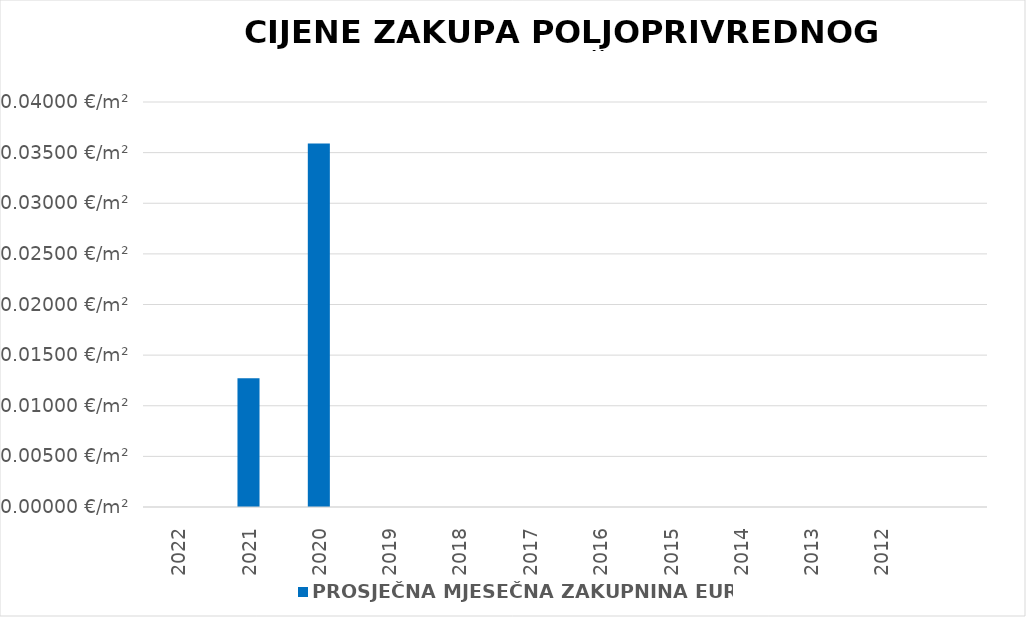
| Category | PROSJEČNA MJESEČNA ZAKUPNINA EUR/m2 |
|---|---|
| 2022 | 0 |
| 2021 | 0.013 |
| 2020 | 0.036 |
| 2019 | 0 |
| 2018 | 0 |
| 2017 | 0 |
| 2016 | 0 |
| 2015 | 0 |
| 2014 | 0 |
| 2013 | 0 |
| 2012 | 0 |